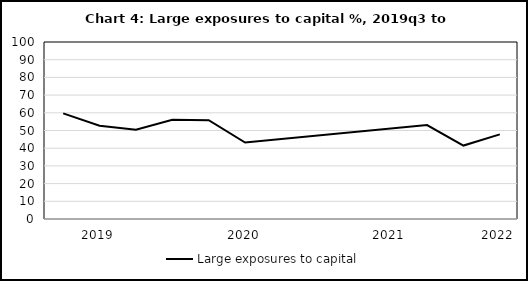
| Category | Large exposures to capital |
|---|---|
| nan | 59.7 |
| 2019.0 | 52.7 |
| nan | 50.4 |
| nan | 56.1 |
| nan | 55.8 |
| 2020.0 | 43.2 |
| nan | 0 |
| nan | 0 |
| nan | 0 |
| 2021.0 | 0 |
| nan | 53.1 |
| nan | 41.5 |
| 2022.0 | 47.8 |